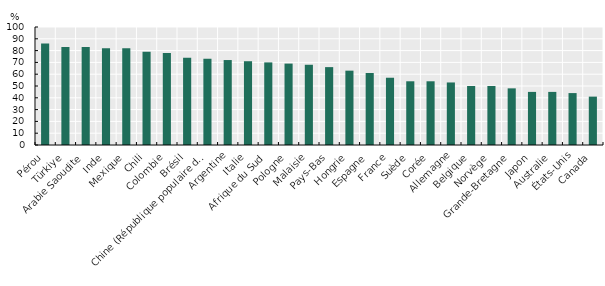
| Category | Series 0 |
|---|---|
| Pérou | 86 |
| Türkiye | 83 |
| Arabie Saoudite | 83 |
| Inde | 82 |
| Mexique | 82 |
| Chili | 79 |
| Colombie | 78 |
| Brésil | 74 |
| Chine (République populaire de) | 73 |
| Argentine | 72 |
| Italie | 71 |
| Afrique du Sud | 70 |
| Pologne | 69 |
| Malaisie | 68 |
| Pays­Bas | 66 |
| Hongrie | 63 |
| Espagne | 61 |
| France | 57 |
| Suède | 54 |
| Corée | 54 |
| Allemagne | 53 |
| Belgique | 50 |
| Norvège | 50 |
| Grande­Bretagne | 48 |
| Japon | 45 |
| Australie | 45 |
| États­Unis | 44 |
| Canada | 41 |